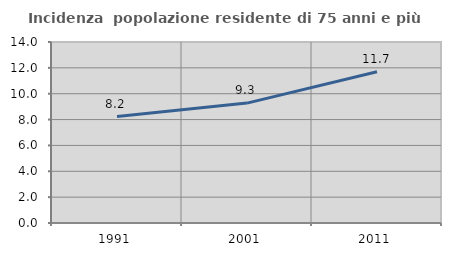
| Category | Incidenza  popolazione residente di 75 anni e più |
|---|---|
| 1991.0 | 8.235 |
| 2001.0 | 9.275 |
| 2011.0 | 11.705 |